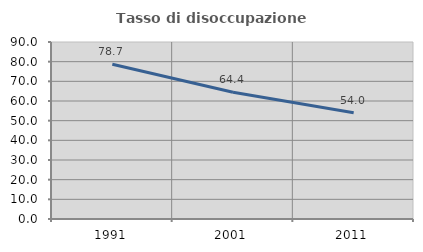
| Category | Tasso di disoccupazione giovanile  |
|---|---|
| 1991.0 | 78.675 |
| 2001.0 | 64.433 |
| 2011.0 | 53.979 |